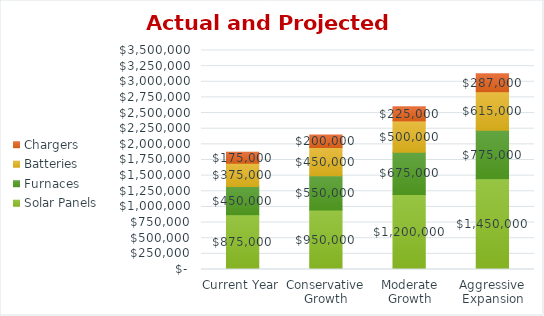
| Category | Solar Panels | Furnaces | Batteries | Chargers |
|---|---|---|---|---|
| Current Year | 875000 | 450000 | 375000 | 175000 |
| Conservative Growth | 950000 | 550000 | 450000 | 200000 |
| Moderate Growth | 1200000 | 675000 | 500000 | 225000 |
| Aggressive Expansion | 1450000 | 775000 | 615000 | 287000 |